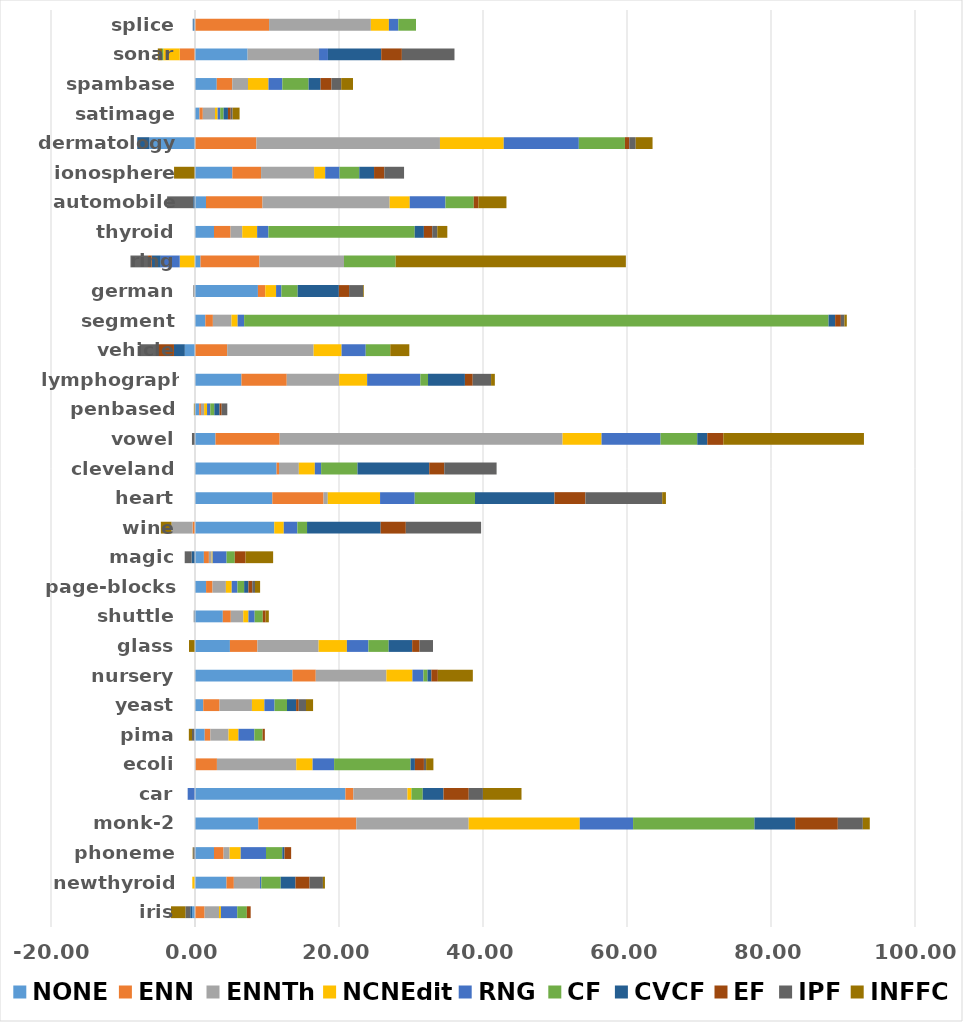
| Category | NONE | ENN | ENNTh | NCNEdit | RNG | CF | CVCF | EF | IPF | INFFC |
|---|---|---|---|---|---|---|---|---|---|---|
| iris | -0.4 | 1.333 | 2 | 0.267 | 2.267 | 1.333 | -0.267 | 0.533 | -0.667 | -2 |
| newthyroid | 4.372 | 1.023 | 3.628 | -0.372 | 0.186 | 2.698 | 2.047 | 1.953 | 1.86 | 0.279 |
| phoneme | 2.635 | 1.332 | 0.84 | 1.54 | 3.512 | 2.265 | 0.303 | 0.925 | -0.252 | -0.07 |
| monk-2 | 8.799 | 13.609 | 15.605 | 15.426 | 7.405 | 16.86 | 5.654 | 5.926 | 3.471 | 0.965 |
| car | 20.891 | 1.099 | 7.512 | 0.556 | -1.019 | 1.574 | 2.882 | 3.508 | 1.968 | 5.358 |
| ecoli | 0.061 | 2.985 | 11.017 | 2.27 | 2.986 | 10.622 | 0.6 | 1.254 | 0.304 | 1.011 |
| pima | 1.351 | 0.78 | 2.527 | 1.376 | 2.212 | 1.144 | -0.051 | 0.309 | -0.364 | -0.442 |
| yeast | 1.145 | 2.264 | 4.501 | 1.725 | 1.415 | 1.726 | 1.266 | 0.363 | 1.01 | 0.984 |
| nursery | 13.548 | 3.224 | 9.814 | 3.61 | 1.527 | 0.57 | 0.539 | 0.895 | -0.016 | 4.861 |
| glass | 4.85 | 3.818 | 8.501 | 3.927 | 2.99 | 2.808 | 3.269 | 1.025 | 1.869 | -0.837 |
| shuttle | 3.862 | 1.113 | 1.729 | 0.717 | 0.864 | 1.131 | -0.101 | 0.395 | -0.074 | 0.441 |
| page-blocks | 1.539 | 0.896 | 1.857 | 0.808 | 0.797 | 0.928 | 0.599 | 0.526 | 0.384 | 0.709 |
| magic | 1.236 | 0.694 | 0.389 | 0.126 | 1.941 | 1.139 | -0.467 | 1.502 | -0.964 | 3.825 |
| wine | 11.01 | -0.343 | -2.924 | 1.321 | 1.889 | 1.343 | 10.225 | 3.495 | 10.454 | -1.479 |
| heart | 10.741 | 7.111 | 0.593 | 7.259 | 4.815 | 8.37 | 11.037 | 4.296 | 10.667 | 0.519 |
| cleveland | 11.332 | 0.332 | 2.758 | 2.218 | 0.876 | 5.051 | 9.967 | 2.082 | 7.272 | 0.001 |
| vowel | 2.848 | 8.909 | 39.293 | 5.414 | 8.202 | 5.091 | 1.394 | 2.222 | -0.424 | 19.535 |
| penbased | 0.579 | 0.251 | 0.438 | 0.404 | 0.449 | 0.562 | 0.733 | 0.286 | 0.782 | -0.157 |
| lymphography | 6.451 | 6.294 | 7.274 | 3.89 | 7.393 | 1.062 | 5.126 | 1.085 | 2.547 | 0.524 |
| vehicle | -1.415 | 4.47 | 12.006 | 3.88 | 3.357 | 3.408 | -1.508 | -2.218 | -2.573 | 2.647 |
| segment | 1.437 | 1.048 | 2.58 | 0.857 | 0.9 | 81.169 | 0.918 | 0.797 | 0.485 | 0.338 |
| german | 8.74 | 1.02 | -0.28 | 1.5 | 0.74 | 2.26 | 5.72 | 1.42 | 1.96 | 0.1 |
| ring | 0.77 | 8.181 | 11.743 | -2.124 | -2.63 | 7.176 | -1.254 | -0.511 | -2.443 | 31.973 |
| thyroid | 2.636 | 2.306 | 1.619 | 2.069 | 1.567 | 20.319 | 1.272 | 1.161 | 0.7 | 1.394 |
| automobile | 1.528 | 7.847 | 17.661 | 2.786 | 4.964 | 3.931 | -0.246 | 0.633 | -3.625 | 3.907 |
| ionosphere | 5.186 | 3.989 | 7.367 | 1.537 | 1.996 | 2.738 | 2.055 | 1.426 | 2.741 | -2.91 |
| dermatology | -6.332 | 8.531 | 25.491 | 8.859 | 10.428 | 6.405 | -1.688 | 0.605 | 0.889 | 2.341 |
| satimage | 0.625 | 0.46 | 1.694 | 0.364 | 0.357 | 0.469 | 0.609 | 0.385 | 0.261 | 0.967 |
| spambase | 3.024 | 2.153 | 2.184 | 2.845 | 1.923 | 3.646 | 1.671 | 1.514 | 1.349 | 1.64 |
| sonar | 7.305 | -2.121 | 9.921 | -2.283 | 1.238 | -0.179 | 7.401 | 2.869 | 7.305 | -0.583 |
| splice | -0.188 | 10.286 | 14.143 | 2.5 | 1.312 | 2.455 | -0.125 | 0 | 0 | 0 |